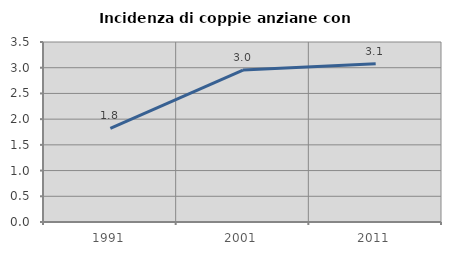
| Category | Incidenza di coppie anziane con figli |
|---|---|
| 1991.0 | 1.822 |
| 2001.0 | 2.955 |
| 2011.0 | 3.079 |